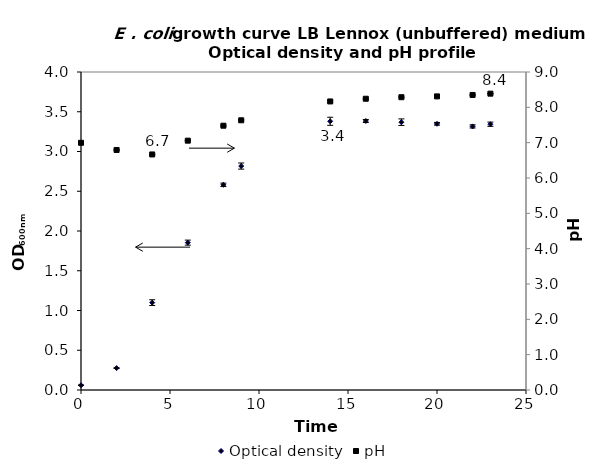
| Category | Optical density |
|---|---|
| 0.0 | 0.06 |
| 2.0 | 0.275 |
| 4.0 | 1.099 |
| 6.0 | 1.854 |
| 8.0 | 2.581 |
| 9.0 | 2.817 |
| 14.0 | 3.38 |
| 16.0 | 3.384 |
| 18.0 | 3.369 |
| 20.0 | 3.348 |
| 22.0 | 3.316 |
| 23.0 | 3.343 |